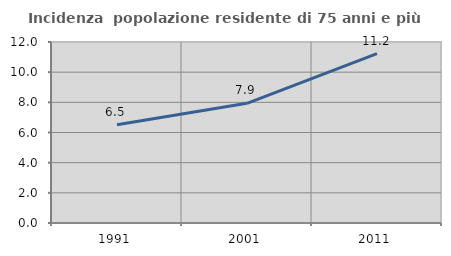
| Category | Incidenza  popolazione residente di 75 anni e più |
|---|---|
| 1991.0 | 6.514 |
| 2001.0 | 7.934 |
| 2011.0 | 11.224 |